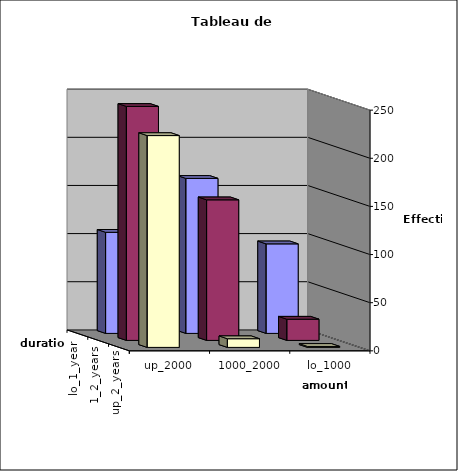
| Category | lo_1_year | 1_2_years | up_2_years |
|---|---|---|---|
| lo_1000 | 93 | 22 | 1 |
| 1000_2000 | 161 | 146 | 9 |
| up_2000 | 105 | 243 | 220 |